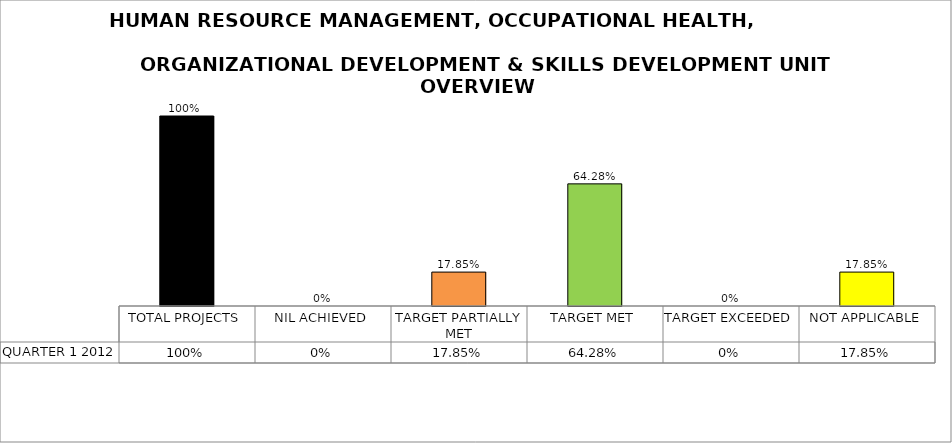
| Category | QUARTER 1 2012 |
|---|---|
| TOTAL PROJECTS | 1 |
| NIL ACHIEVED | 0 |
| TARGET PARTIALLY MET | 0.178 |
| TARGET MET | 0.643 |
| TARGET EXCEEDED | 0 |
| NOT APPLICABLE | 0.178 |